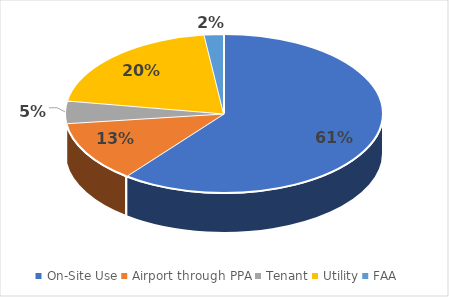
| Category | Series 0 |
|---|---|
| On-Site Use | 92 |
| Airport through PPA | 19 |
| Tenant | 7 |
| Utility | 31 |
| FAA | 3 |